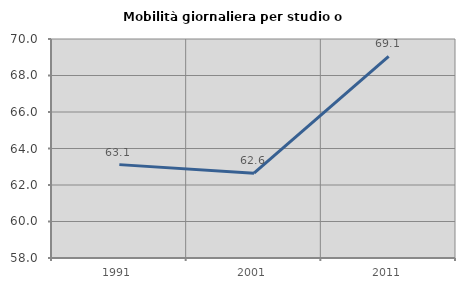
| Category | Mobilità giornaliera per studio o lavoro |
|---|---|
| 1991.0 | 63.116 |
| 2001.0 | 62.648 |
| 2011.0 | 69.053 |